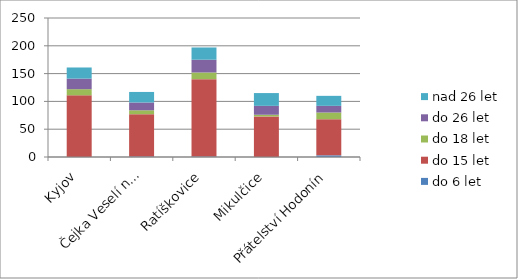
| Category | do 6 let | do 15 let | do 18 let | do 26 let | nad 26 let |
|---|---|---|---|---|---|
| Kyjov | 0 | 111 | 11 | 19 | 20 |
| Čejka Veselí n.M. | 1 | 76 | 7 | 14 | 19 |
| Ratíškovice | 1 | 139 | 12 | 23 | 22 |
| Mikulčice | 0 | 73 | 3 | 16 | 23 |
| Přátelství Hodonín | 3 | 65 | 12 | 12 | 18 |